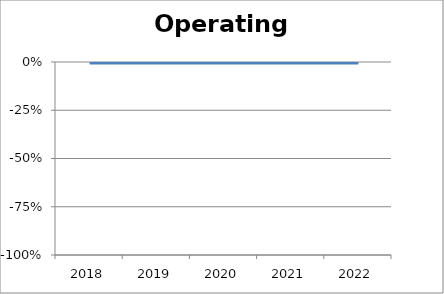
| Category | Operating margin |
|---|---|
| 2018.0 | 0 |
| 2019.0 | 0 |
| 2020.0 | 0 |
| 2021.0 | 0 |
| 2022.0 | 0 |